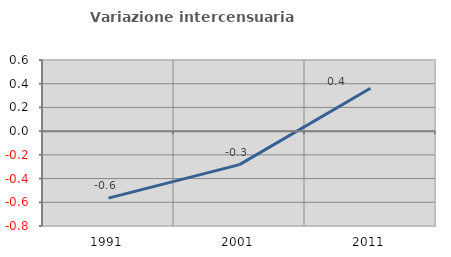
| Category | Variazione intercensuaria annua |
|---|---|
| 1991.0 | -0.565 |
| 2001.0 | -0.282 |
| 2011.0 | 0.362 |